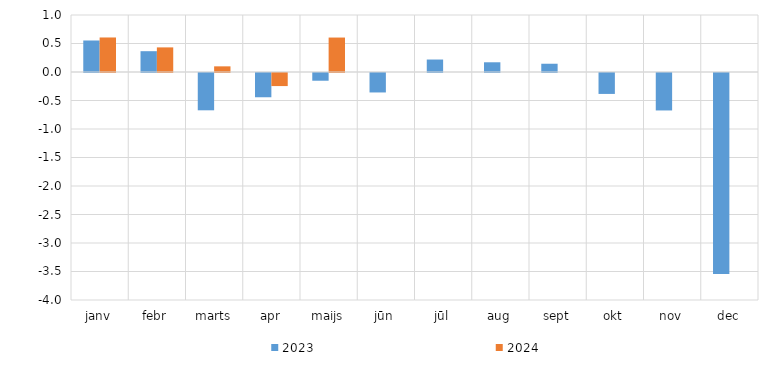
| Category | 2023 | 2024 |
|---|---|---|
| janv | 0.553 | 0.606 |
| febr | 0.365 | 0.432 |
| marts | -0.654 | 0.099 |
| apr | -0.426 | -0.229 |
| maijs | -0.136 | 0.604 |
| jūn | -0.341 | 0 |
| jūl | 0.219 | 0 |
| aug | 0.171 | 0 |
| sept | 0.145 | 0 |
| okt | -0.367 | 0 |
| nov | -0.657 | 0 |
| dec | -3.527 | 0 |